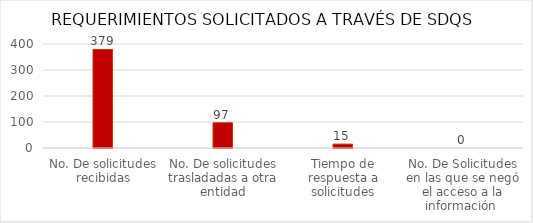
| Category | Series 0 |
|---|---|
| No. De solicitudes recibidas | 379 |
| No. De solicitudes trasladadas a otra entidad | 97 |
| Tiempo de respuesta a solicitudes | 15 |
| No. De Solicitudes en las que se negó el acceso a la información  | 0 |